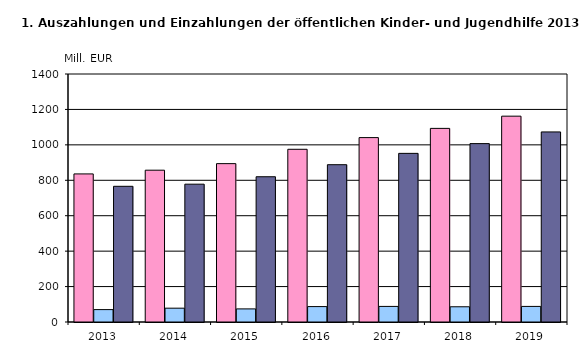
| Category | Ausgaben insgesamt | Einnahmen insgesamt | reine Ausgaben insgesamt |
|---|---|---|---|
| 2013.0 | 836 | 70 | 766 |
| 2014.0 | 857 | 78 | 778 |
| 2015.0 | 894 | 74 | 820 |
| 2016.0 | 975 | 87 | 888 |
| 2017.0 | 1041 | 88 | 952 |
| 2018.0 | 1093 | 86 | 1007 |
| 2019.0 | 1162 | 88 | 1073 |